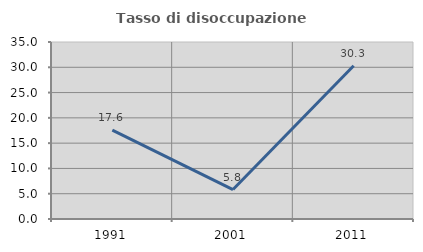
| Category | Tasso di disoccupazione giovanile  |
|---|---|
| 1991.0 | 17.593 |
| 2001.0 | 5.825 |
| 2011.0 | 30.303 |